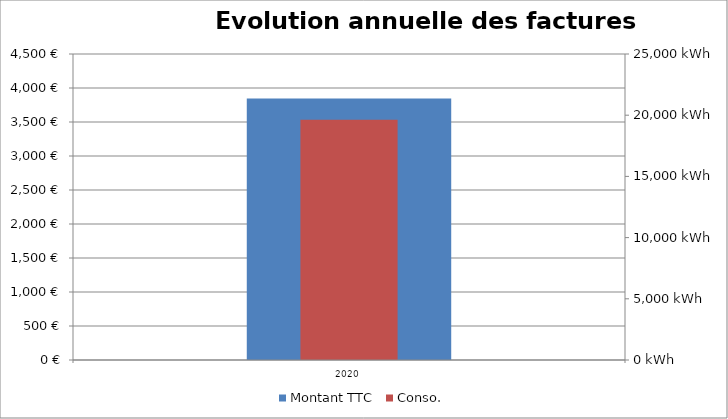
| Category | Montant TTC |
|---|---|
| 2020 | 3845 |